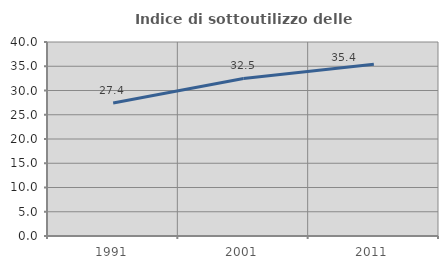
| Category | Indice di sottoutilizzo delle abitazioni  |
|---|---|
| 1991.0 | 27.413 |
| 2001.0 | 32.477 |
| 2011.0 | 35.419 |